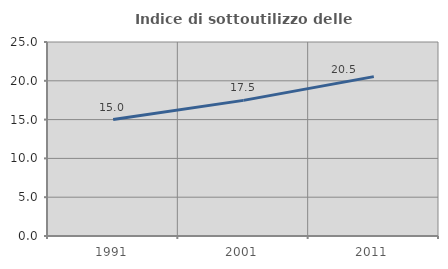
| Category | Indice di sottoutilizzo delle abitazioni  |
|---|---|
| 1991.0 | 15 |
| 2001.0 | 17.476 |
| 2011.0 | 20.536 |